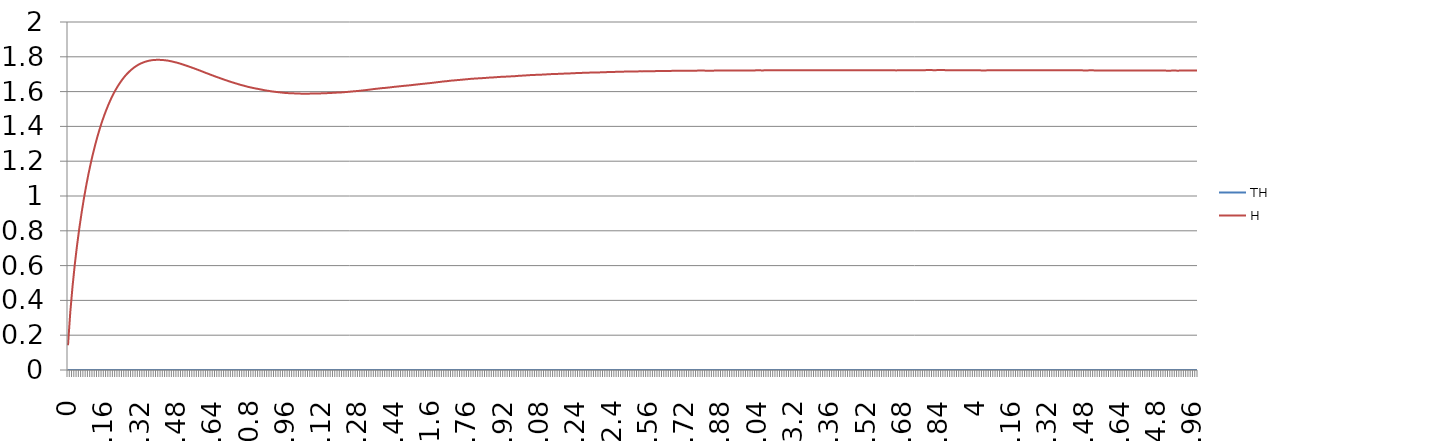
| Category | TH | H |
|---|---|---|
| 0 | 0 | 0.142 |
| 0,01 | 0 | 0.332 |
| 0,02 | 0 | 0.48 |
| 0,03 | 0 | 0.607 |
| 0,04 | 0 | 0.718 |
| 0,05 | 0 | 0.816 |
| 0,06 | 0 | 0.904 |
| 0,07 | 0 | 0.985 |
| 0,08 | 0 | 1.058 |
| 0,09 | 0 | 1.125 |
| 0,1 | 0 | 1.186 |
| 0,11 | 0 | 1.243 |
| 0,12 | 0 | 1.295 |
| 0,13 | 0 | 1.343 |
| 0,14 | 0 | 1.387 |
| 0,15 | 0 | 1.427 |
| 0,16 | 0 | 1.465 |
| 0,17 | 0 | 1.499 |
| 0,18 | 0 | 1.531 |
| 0,19 | 0 | 1.56 |
| 0,2 | 0 | 1.586 |
| 0,21 | 0 | 1.61 |
| 0,22 | 0 | 1.632 |
| 0,23 | 0 | 1.652 |
| 0,24 | 0 | 1.671 |
| 0,25 | 0 | 1.687 |
| 0,26 | 0 | 1.702 |
| 0,27 | 0 | 1.715 |
| 0,28 | 0 | 1.727 |
| 0,29 | 0 | 1.737 |
| 0,3 | 0 | 1.746 |
| 0,31 | 0 | 1.754 |
| 0,32 | 0 | 1.761 |
| 0,33 | 0 | 1.767 |
| 0,34 | 0 | 1.772 |
| 0,35 | 0 | 1.775 |
| 0,36 | 0 | 1.778 |
| 0,37 | 0 | 1.78 |
| 0,38 | 0 | 1.782 |
| 0,39 | 0 | 1.782 |
| 0,4 | 0 | 1.783 |
| 0,41 | 0 | 1.782 |
| 0,42 | 0 | 1.781 |
| 0,43 | 0 | 1.78 |
| 0,44 | 0 | 1.778 |
| 0,45 | 0 | 1.775 |
| 0,46 | 0 | 1.773 |
| 0,47 | 0 | 1.77 |
| 0,48 | 0 | 1.766 |
| 0,49 | 0 | 1.762 |
| 0,5 | 0 | 1.758 |
| 0,51 | 0 | 1.754 |
| 0,52 | 0 | 1.75 |
| 0,53 | 0 | 1.745 |
| 0,54 | 0 | 1.741 |
| 0,55 | 0 | 1.736 |
| 0,56 | 0 | 1.731 |
| 0,57 | 0 | 1.726 |
| 0,58 | 0 | 1.722 |
| 0,59 | 0 | 1.716 |
| 0,6 | 0 | 1.711 |
| 0,61 | 0 | 1.706 |
| 0,62 | 0 | 1.702 |
| 0,63 | 0 | 1.696 |
| 0,64 | 0 | 1.692 |
| 0,65 | 0 | 1.686 |
| 0,66 | 0 | 1.682 |
| 0,67 | 0 | 1.677 |
| 0,68 | 0 | 1.673 |
| 0,69 | 0 | 1.668 |
| 0,7 | 0 | 1.664 |
| 0,71 | 0 | 1.659 |
| 0,72 | 0 | 1.655 |
| 0,73 | 0 | 1.651 |
| 0,74 | 0 | 1.647 |
| 0,75 | 0 | 1.643 |
| 0,76 | 0 | 1.639 |
| 0,77 | 0 | 1.636 |
| 0,78 | 0 | 1.632 |
| 0,79 | 0 | 1.628 |
| 0,8 | 0 | 1.625 |
| 0,81 | 0 | 1.622 |
| 0,82 | 0 | 1.62 |
| 0,83 | 0 | 1.617 |
| 0,84 | 0 | 1.615 |
| 0,85 | 0 | 1.612 |
| 0,86 | 0 | 1.61 |
| 0,87 | 0 | 1.607 |
| 0,88 | 0 | 1.605 |
| 0,89 | 0 | 1.603 |
| 0,9 | 0 | 1.601 |
| 0,91 | 0 | 1.599 |
| 0,92 | 0 | 1.598 |
| 0,93 | 0 | 1.596 |
| 0,94 | 0 | 1.595 |
| 0,95 | 0 | 1.593 |
| 0,96 | 0 | 1.592 |
| 0,97 | 0 | 1.591 |
| 0,98 | 0 | 1.59 |
| 0,99 | 0 | 1.59 |
| 1 | 0 | 1.59 |
| 1,01 | 0 | 1.589 |
| 1,02 | 0 | 1.588 |
| 1,03 | 0 | 1.588 |
| 1,04 | 0 | 1.588 |
| 1,05 | 0 | 1.588 |
| 1,06 | 0 | 1.588 |
| 1,07 | 0 | 1.588 |
| 1,08 | 0 | 1.589 |
| 1,09 | 0 | 1.589 |
| 1,1 | 0 | 1.59 |
| 1,11 | 0 | 1.59 |
| 1,12 | 0 | 1.59 |
| 1,13 | 0 | 1.59 |
| 1,14 | 0 | 1.591 |
| 1,15 | 0 | 1.592 |
| 1,16 | 0 | 1.592 |
| 1,17 | 0 | 1.593 |
| 1,18 | 0 | 1.594 |
| 1,19 | 0 | 1.595 |
| 1,2 | 0 | 1.595 |
| 1,21 | 0 | 1.596 |
| 1,22 | 0 | 1.597 |
| 1,23 | 0 | 1.598 |
| 1,24 | 0 | 1.599 |
| 1,25 | 0 | 1.601 |
| 1,26 | 0 | 1.602 |
| 1,27 | 0 | 1.603 |
| 1,28 | 0 | 1.604 |
| 1,29 | 0 | 1.605 |
| 1,3 | 0 | 1.607 |
| 1,31 | 0 | 1.608 |
| 1,32 | 0 | 1.61 |
| 1,33 | 0 | 1.612 |
| 1,34 | 0 | 1.613 |
| 1,35 | 0 | 1.615 |
| 1,36 | 0 | 1.616 |
| 1,37 | 0 | 1.618 |
| 1,38 | 0 | 1.62 |
| 1,39 | 0 | 1.621 |
| 1,4 | 0 | 1.622 |
| 1,41 | 0 | 1.623 |
| 1,42 | 0 | 1.624 |
| 1,43 | 0 | 1.626 |
| 1,44 | 0 | 1.628 |
| 1,45 | 0 | 1.629 |
| 1,46 | 0 | 1.63 |
| 1,47 | 0 | 1.632 |
| 1,48 | 0 | 1.633 |
| 1,49 | 0 | 1.634 |
| 1,5 | 0 | 1.635 |
| 1,51 | 0 | 1.637 |
| 1,52 | 0 | 1.638 |
| 1,53 | 0 | 1.64 |
| 1,54 | 0 | 1.641 |
| 1,55 | 0 | 1.643 |
| 1,56 | 0 | 1.644 |
| 1,57 | 0 | 1.645 |
| 1,58 | 0 | 1.647 |
| 1,59 | 0 | 1.648 |
| 1,6 | 0 | 1.65 |
| 1,61 | 0 | 1.651 |
| 1,62 | 0 | 1.653 |
| 1,63 | 0 | 1.654 |
| 1,64 | 0 | 1.656 |
| 1,65 | 0 | 1.658 |
| 1,66 | 0 | 1.659 |
| 1,67 | 0 | 1.66 |
| 1,68 | 0 | 1.662 |
| 1,69 | 0 | 1.663 |
| 1,7 | 0 | 1.664 |
| 1,71 | 0 | 1.665 |
| 1,72 | 0 | 1.667 |
| 1,73 | 0 | 1.668 |
| 1,74 | 0 | 1.669 |
| 1,75 | 0 | 1.67 |
| 1,76 | 0 | 1.671 |
| 1,77 | 0 | 1.673 |
| 1,78 | 0 | 1.674 |
| 1,79 | 0 | 1.675 |
| 1,8 | 0 | 1.676 |
| 1,81 | 0 | 1.676 |
| 1,82 | 0 | 1.677 |
| 1,83 | 0 | 1.678 |
| 1,84 | 0 | 1.679 |
| 1,85 | 0 | 1.68 |
| 1,86 | 0 | 1.681 |
| 1,87 | 0 | 1.681 |
| 1,88 | 0 | 1.682 |
| 1,89 | 0 | 1.683 |
| 1,9 | 0 | 1.684 |
| 1,91 | 0 | 1.685 |
| 1,92 | 0 | 1.686 |
| 1,93 | 0 | 1.686 |
| 1,94 | 0 | 1.687 |
| 1,95 | 0 | 1.687 |
| 1,96 | 0 | 1.688 |
| 1,97 | 0 | 1.689 |
| 1,98 | 0 | 1.69 |
| 1,99 | 0 | 1.691 |
| 2 | 0 | 1.692 |
| 2,01 | 0 | 1.692 |
| 2,02 | 0 | 1.693 |
| 2,03 | 0 | 1.694 |
| 2,04 | 0 | 1.695 |
| 2,05 | 0 | 1.696 |
| 2,06 | 0 | 1.696 |
| 2,07 | 0 | 1.697 |
| 2,08 | 0 | 1.697 |
| 2,09 | 0 | 1.698 |
| 2,1 | 0 | 1.698 |
| 2,11 | 0 | 1.699 |
| 2,12 | 0 | 1.7 |
| 2,13 | 0 | 1.7 |
| 2,14 | 0 | 1.701 |
| 2,15 | 0 | 1.701 |
| 2,16 | 0 | 1.702 |
| 2,17 | 0 | 1.702 |
| 2,18 | 0 | 1.703 |
| 2,19 | 0 | 1.704 |
| 2,2 | 0 | 1.704 |
| 2,21 | 0 | 1.704 |
| 2,22 | 0 | 1.705 |
| 2,23 | 0 | 1.706 |
| 2,24 | 0 | 1.706 |
| 2,25 | 0 | 1.707 |
| 2,26 | 0 | 1.707 |
| 2,27 | 0 | 1.708 |
| 2,28 | 0 | 1.708 |
| 2,29 | 0 | 1.709 |
| 2,3 | 0 | 1.709 |
| 2,31 | 0 | 1.71 |
| 2,32 | 0 | 1.71 |
| 2,33 | 0 | 1.71 |
| 2,34 | 0 | 1.71 |
| 2,35 | 0 | 1.711 |
| 2,36 | 0 | 1.711 |
| 2,37 | 0 | 1.712 |
| 2,38 | 0 | 1.712 |
| 2,39 | 0 | 1.713 |
| 2,4 | 0 | 1.713 |
| 2,41 | 0 | 1.713 |
| 2,42 | 0 | 1.714 |
| 2,43 | 0 | 1.714 |
| 2,44 | 0 | 1.714 |
| 2,45 | 0 | 1.715 |
| 2,46 | 0 | 1.715 |
| 2,47 | 0 | 1.715 |
| 2,48 | 0 | 1.715 |
| 2,49 | 0 | 1.716 |
| 2,5 | 0 | 1.716 |
| 2,51 | 0 | 1.716 |
| 2,52 | 0 | 1.716 |
| 2,53 | 0 | 1.716 |
| 2,54 | 0 | 1.716 |
| 2,55 | 0 | 1.716 |
| 2,56 | 0 | 1.717 |
| 2,57 | 0 | 1.717 |
| 2,58 | 0 | 1.717 |
| 2,59 | 0 | 1.718 |
| 2,6 | 0 | 1.718 |
| 2,61 | 0 | 1.718 |
| 2,62 | 0 | 1.718 |
| 2,63 | 0 | 1.718 |
| 2,64 | 0 | 1.718 |
| 2,65 | 0 | 1.719 |
| 2,66 | 0 | 1.719 |
| 2,67 | 0 | 1.72 |
| 2,68 | 0 | 1.72 |
| 2,69 | 0 | 1.72 |
| 2,7 | 0 | 1.72 |
| 2,71 | 0 | 1.72 |
| 2,72 | 0 | 1.72 |
| 2,73 | 0 | 1.72 |
| 2,74 | 0 | 1.72 |
| 2,75 | 0 | 1.72 |
| 2,76 | 0 | 1.72 |
| 2,77 | 0 | 1.72 |
| 2,78 | 0 | 1.721 |
| 2,79 | 0 | 1.721 |
| 2,8 | 0 | 1.721 |
| 2,81 | 0 | 1.72 |
| 2,82 | 0 | 1.72 |
| 2,83 | 0 | 1.72 |
| 2,84 | 0 | 1.72 |
| 2,85 | 0 | 1.721 |
| 2,86 | 0 | 1.721 |
| 2,87 | 0 | 1.721 |
| 2,88 | 0 | 1.721 |
| 2,89 | 0 | 1.721 |
| 2,9 | 0 | 1.722 |
| 2,91 | 0 | 1.722 |
| 2,92 | 0 | 1.722 |
| 2,93 | 0 | 1.722 |
| 2,94 | 0 | 1.721 |
| 2,95 | 0 | 1.721 |
| 2,96 | 0 | 1.721 |
| 2,97 | 0 | 1.721 |
| 2,98 | 0 | 1.721 |
| 2,99 | 0 | 1.721 |
| 3 | 0 | 1.721 |
| 3,01 | 0 | 1.721 |
| 3,02 | 0 | 1.722 |
| 3,03 | 0 | 1.722 |
| 3,04 | 0 | 1.722 |
| 3,05 | 0 | 1.722 |
| 3,06 | 0 | 1.722 |
| 3,07 | 0 | 1.722 |
| 3,08 | 0 | 1.722 |
| 3,09 | 0 | 1.722 |
| 3,1 | 0 | 1.722 |
| 3,11 | 0 | 1.722 |
| 3,12 | 0 | 1.722 |
| 3,13 | 0 | 1.723 |
| 3,14 | 0 | 1.723 |
| 3,15 | 0 | 1.722 |
| 3,16 | 0 | 1.722 |
| 3,17 | 0 | 1.722 |
| 3,18 | 0 | 1.722 |
| 3,19 | 0 | 1.722 |
| 3,2 | 0 | 1.722 |
| 3,21 | 0 | 1.722 |
| 3,22 | 0 | 1.722 |
| 3,23 | 0 | 1.722 |
| 3,24 | 0 | 1.722 |
| 3,25 | 0 | 1.722 |
| 3,26 | 0 | 1.722 |
| 3,27 | 0 | 1.722 |
| 3,28 | 0 | 1.722 |
| 3,29 | 0 | 1.722 |
| 3,3 | 0 | 1.722 |
| 3,31 | 0 | 1.722 |
| 3,32 | 0 | 1.722 |
| 3,33 | 0 | 1.722 |
| 3,34 | 0 | 1.722 |
| 3,35 | 0 | 1.723 |
| 3,36 | 0 | 1.723 |
| 3,37 | 0 | 1.722 |
| 3,38 | 0 | 1.722 |
| 3,39 | 0 | 1.722 |
| 3,4 | 0 | 1.722 |
| 3,41 | 0 | 1.722 |
| 3,42 | 0 | 1.722 |
| 3,43 | 0 | 1.723 |
| 3,44 | 0 | 1.723 |
| 3,45 | 0 | 1.723 |
| 3,46 | 0 | 1.723 |
| 3,47 | 0 | 1.723 |
| 3,48 | 0 | 1.722 |
| 3,49 | 0 | 1.722 |
| 3,5 | 0 | 1.722 |
| 3,51 | 0 | 1.722 |
| 3,52 | 0 | 1.723 |
| 3,53 | 0 | 1.723 |
| 3,54 | 0 | 1.722 |
| 3,55 | 0 | 1.723 |
| 3,56 | 0 | 1.723 |
| 3,57 | 0 | 1.723 |
| 3,58 | 0 | 1.723 |
| 3,59 | 0 | 1.723 |
| 3,6 | 0 | 1.722 |
| 3,61 | 0 | 1.722 |
| 3,62 | 0 | 1.722 |
| 3,63 | 0 | 1.722 |
| 3,64 | 0 | 1.722 |
| 3,65 | 0 | 1.722 |
| 3,66 | 0 | 1.722 |
| 3,67 | 0 | 1.722 |
| 3,68 | 0 | 1.723 |
| 3,69 | 0 | 1.723 |
| 3,7 | 0 | 1.723 |
| 3,71 | 0 | 1.723 |
| 3,72 | 0 | 1.723 |
| 3,73 | 0 | 1.723 |
| 3,74 | 0 | 1.723 |
| 3,75 | 0 | 1.723 |
| 3,76 | 0 | 1.723 |
| 3,77 | 0 | 1.723 |
| 3,78 | 0 | 1.723 |
| 3,79 | 0 | 1.724 |
| 3,8 | 0 | 1.724 |
| 3,81 | 0 | 1.723 |
| 3,82 | 0 | 1.723 |
| 3,83 | 0 | 1.724 |
| 3,84 | 0 | 1.724 |
| 3,85 | 0 | 1.724 |
| 3,86 | 0 | 1.724 |
| 3,87 | 0 | 1.723 |
| 3,88 | 0 | 1.723 |
| 3,89 | 0 | 1.723 |
| 3,9 | 0 | 1.723 |
| 3,91 | 0 | 1.723 |
| 3,92 | 0 | 1.723 |
| 3,93 | 0 | 1.722 |
| 3,94 | 0 | 1.722 |
| 3,95 | 0 | 1.722 |
| 3,96 | 0 | 1.722 |
| 3,97 | 0 | 1.722 |
| 3,98 | 0 | 1.722 |
| 3,99 | 0 | 1.722 |
| 4 | 0 | 1.722 |
| 4,01 | 0 | 1.722 |
| 4,02 | 0 | 1.722 |
| 4,03 | 0 | 1.722 |
| 4,04 | 0 | 1.722 |
| 4,05 | 0 | 1.722 |
| 4,06 | 0 | 1.722 |
| 4,07 | 0 | 1.722 |
| 4,08 | 0 | 1.722 |
| 4,09 | 0 | 1.723 |
| 4,1 | 0 | 1.723 |
| 4,11 | 0 | 1.723 |
| 4,12 | 0 | 1.723 |
| 4,13 | 0 | 1.723 |
| 4,14 | 0 | 1.723 |
| 4,15 | 0 | 1.722 |
| 4,16 | 0 | 1.722 |
| 4,17 | 0 | 1.723 |
| 4,18 | 0 | 1.723 |
| 4,19 | 0 | 1.723 |
| 4,2 | 0 | 1.723 |
| 4,21 | 0 | 1.723 |
| 4,22 | 0 | 1.723 |
| 4,23 | 0 | 1.723 |
| 4,24 | 0 | 1.723 |
| 4,25 | 0 | 1.723 |
| 4,26 | 0 | 1.723 |
| 4,27 | 0 | 1.723 |
| 4,28 | 0 | 1.723 |
| 4,29 | 0 | 1.723 |
| 4,3 | 0 | 1.723 |
| 4,31 | 0 | 1.723 |
| 4,32 | 0 | 1.723 |
| 4,33 | 0 | 1.723 |
| 4,34 | 0 | 1.722 |
| 4,35 | 0 | 1.722 |
| 4,36 | 0 | 1.722 |
| 4,37 | 0 | 1.722 |
| 4,38 | 0 | 1.722 |
| 4,39 | 0 | 1.722 |
| 4,4 | 0 | 1.722 |
| 4,41 | 0 | 1.722 |
| 4,42 | 0 | 1.722 |
| 4,43 | 0 | 1.723 |
| 4,44 | 0 | 1.722 |
| 4,45 | 0 | 1.722 |
| 4,46 | 0 | 1.722 |
| 4,47 | 0 | 1.722 |
| 4,48 | 0 | 1.722 |
| 4,49 | 0 | 1.722 |
| 4,5 | 0 | 1.722 |
| 4,51 | 0 | 1.722 |
| 4,52 | 0 | 1.722 |
| 4,53 | 0 | 1.721 |
| 4,54 | 0 | 1.721 |
| 4,55 | 0 | 1.721 |
| 4,56 | 0 | 1.721 |
| 4,57 | 0 | 1.721 |
| 4,58 | 0 | 1.721 |
| 4,59 | 0 | 1.721 |
| 4,6 | 0 | 1.721 |
| 4,61 | 0 | 1.721 |
| 4,62 | 0 | 1.721 |
| 4,63 | 0 | 1.721 |
| 4,64 | 0 | 1.721 |
| 4,65 | 0 | 1.721 |
| 4,66 | 0 | 1.721 |
| 4,67 | 0 | 1.721 |
| 4,68 | 0 | 1.721 |
| 4,69 | 0 | 1.721 |
| 4,7 | 0 | 1.721 |
| 4,71 | 0 | 1.721 |
| 4,72 | 0 | 1.721 |
| 4,73 | 0 | 1.721 |
| 4,74 | 0 | 1.721 |
| 4,75 | 0 | 1.721 |
| 4,76 | 0 | 1.721 |
| 4,77 | 0 | 1.721 |
| 4,78 | 0 | 1.721 |
| 4,79 | 0 | 1.721 |
| 4,8 | 0 | 1.722 |
| 4,81 | 0 | 1.722 |
| 4,82 | 0 | 1.721 |
| 4,83 | 0 | 1.721 |
| 4,84 | 0 | 1.72 |
| 4,85 | 0 | 1.72 |
| 4,86 | 0 | 1.72 |
| 4,87 | 0 | 1.721 |
| 4,88 | 0 | 1.721 |
| 4,89 | 0 | 1.72 |
| 4,9 | 0 | 1.721 |
| 4,91 | 0 | 1.721 |
| 4,92 | 0 | 1.721 |
| 4,93 | 0 | 1.721 |
| 4,94 | 0 | 1.721 |
| 4,95 | 0 | 1.721 |
| 4,96 | 0 | 1.721 |
| 4,97 | 0 | 1.721 |
| 4,98 | 0 | 1.721 |